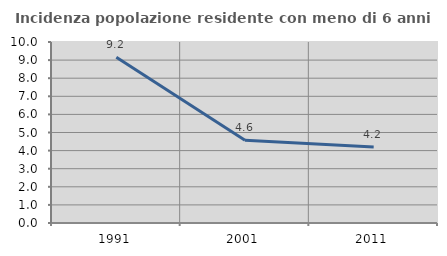
| Category | Incidenza popolazione residente con meno di 6 anni |
|---|---|
| 1991.0 | 9.152 |
| 2001.0 | 4.571 |
| 2011.0 | 4.206 |